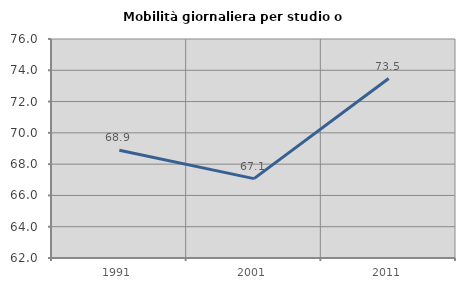
| Category | Mobilità giornaliera per studio o lavoro |
|---|---|
| 1991.0 | 68.885 |
| 2001.0 | 67.076 |
| 2011.0 | 73.475 |